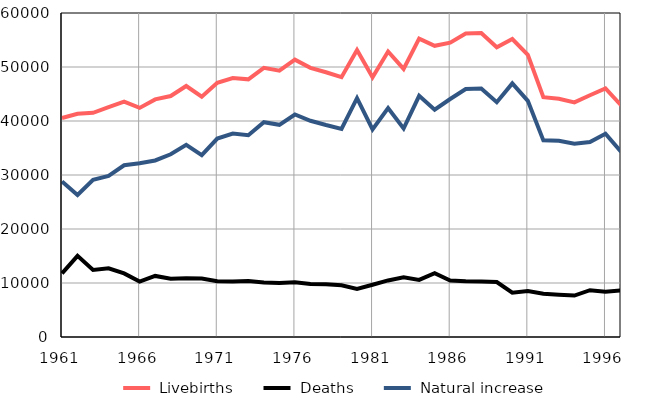
| Category |  Livebirths |  Deaths |  Natural increase |
|---|---|---|---|
| 1961.0 | 40561 | 11759 | 28802 |
| 1962.0 | 41336 | 15024 | 26312 |
| 1963.0 | 41525 | 12423 | 29102 |
| 1964.0 | 42557 | 12731 | 29826 |
| 1965.0 | 43569 | 11767 | 31802 |
| 1966.0 | 42429 | 10266 | 32163 |
| 1967.0 | 44001 | 11308 | 32693 |
| 1968.0 | 44627 | 10781 | 33846 |
| 1969.0 | 46480 | 10892 | 35588 |
| 1970.0 | 44496 | 10829 | 33667 |
| 1971.0 | 47060 | 10312 | 36748 |
| 1972.0 | 47943 | 10270 | 37673 |
| 1973.0 | 47714 | 10358 | 37356 |
| 1974.0 | 49847 | 10075 | 39772 |
| 1975.0 | 49310 | 10018 | 39292 |
| 1976.0 | 51355 | 10149 | 41206 |
| 1977.0 | 49849 | 9811 | 40038 |
| 1978.0 | 49027 | 9776 | 39251 |
| 1979.0 | 48125 | 9575 | 38550 |
| 1980.0 | 53147 | 8909 | 44238 |
| 1981.0 | 48111 | 9677 | 38434 |
| 1982.0 | 52865 | 10479 | 42386 |
| 1983.0 | 49645 | 11040 | 38605 |
| 1984.0 | 55243 | 10573 | 44670 |
| 1985.0 | 53925 | 11826 | 42099 |
| 1986.0 | 54519 | 10446 | 44073 |
| 1987.0 | 56221 | 10307 | 45914 |
| 1988.0 | 56283 | 10257 | 46026 |
| 1989.0 | 53656 | 10181 | 43475 |
| 1990.0 | 55175 | 8214 | 46961 |
| 1991.0 | 52263 | 8526 | 43737 |
| 1992.0 | 44418 | 8004 | 36414 |
| 1993.0 | 44132 | 7804 | 36328 |
| 1994.0 | 43450 | 7667 | 35783 |
| 1995.0 | 44776 | 8671 | 36105 |
| 1996.0 | 46041 | 8392 | 37649 |
| 1997.0 | 42920 | 8624 | 34296 |